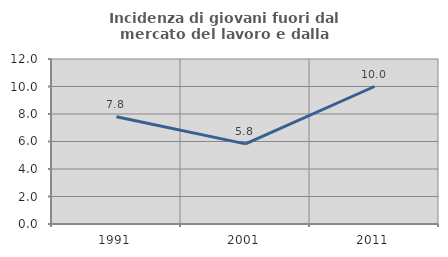
| Category | Incidenza di giovani fuori dal mercato del lavoro e dalla formazione  |
|---|---|
| 1991.0 | 7.801 |
| 2001.0 | 5.825 |
| 2011.0 | 10 |